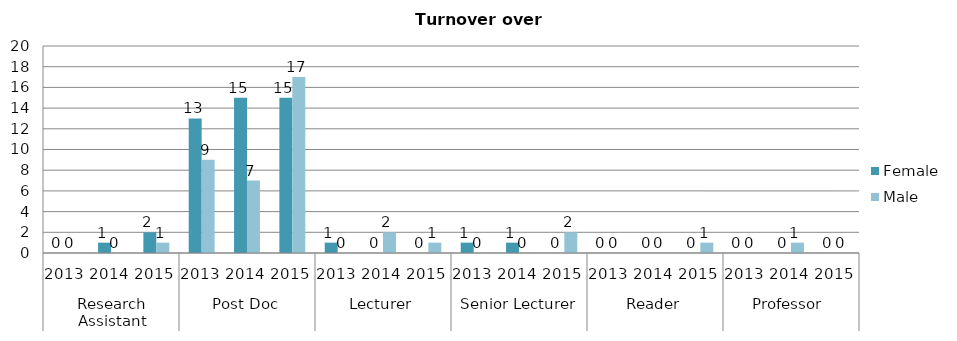
| Category | Female | Male |
|---|---|---|
| 0 | 0 | 0 |
| 1 | 1 | 0 |
| 2 | 2 | 1 |
| 3 | 13 | 9 |
| 4 | 15 | 7 |
| 5 | 15 | 17 |
| 6 | 1 | 0 |
| 7 | 0 | 2 |
| 8 | 0 | 1 |
| 9 | 1 | 0 |
| 10 | 1 | 0 |
| 11 | 0 | 2 |
| 12 | 0 | 0 |
| 13 | 0 | 0 |
| 14 | 0 | 1 |
| 15 | 0 | 0 |
| 16 | 0 | 1 |
| 17 | 0 | 0 |